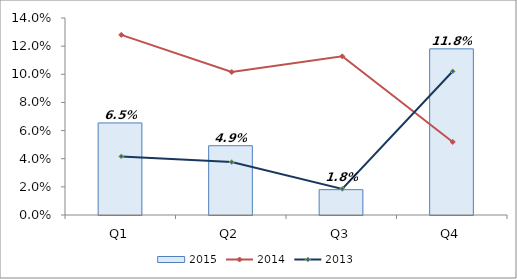
| Category | 2015 |
|---|---|
| Q1 | 0.065 |
| Q2 | 0.049 |
| Q3 | 0.018 |
| Q4 | 0.118 |